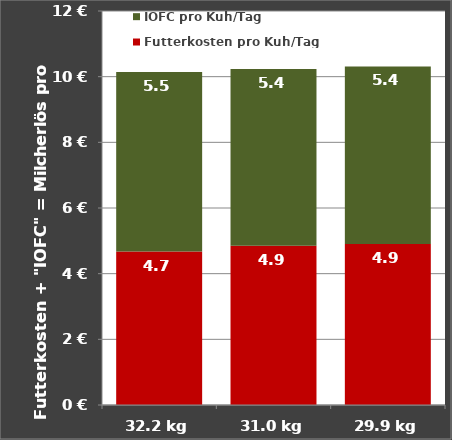
| Category | Futterkosten pro Kuh/Tag
mit weniger/mehr nXP | IOFC pro Kuh/Tag |
|---|---|---|
| 32.19308545335943 | 4.672 | 5.469 |
| 31.0 | 4.85 | 5.38 |
| 29.892186553603874 | 4.905 | 5.408 |